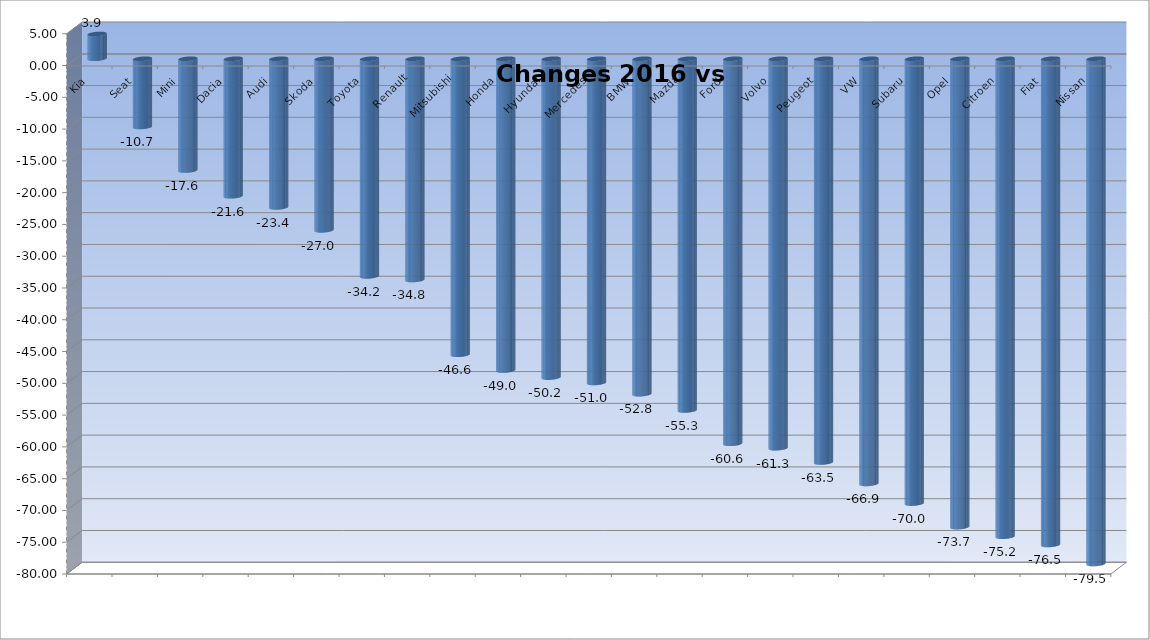
| Category | Ytd 2015 |
|---|---|
| Kia | 3.9 |
| Seat | -10.726 |
| Mini | -17.58 |
| Dacia | -21.632 |
| Audi | -23.382 |
| Skoda | -26.994 |
| Toyota | -34.241 |
| Renault | -34.803 |
| Mitsubishi | -46.57 |
| Honda | -49.049 |
| Hyundai | -50.161 |
| Mercedes | -50.996 |
| BMW | -52.767 |
| Mazda | -55.334 |
| Ford | -60.571 |
| Volvo | -61.273 |
| Peugeot | -63.517 |
| VW | -66.884 |
| Subaru | -69.98 |
| Opel | -73.684 |
| Citroen | -75.193 |
| Fiat | -76.49 |
| Nissan | -79.485 |